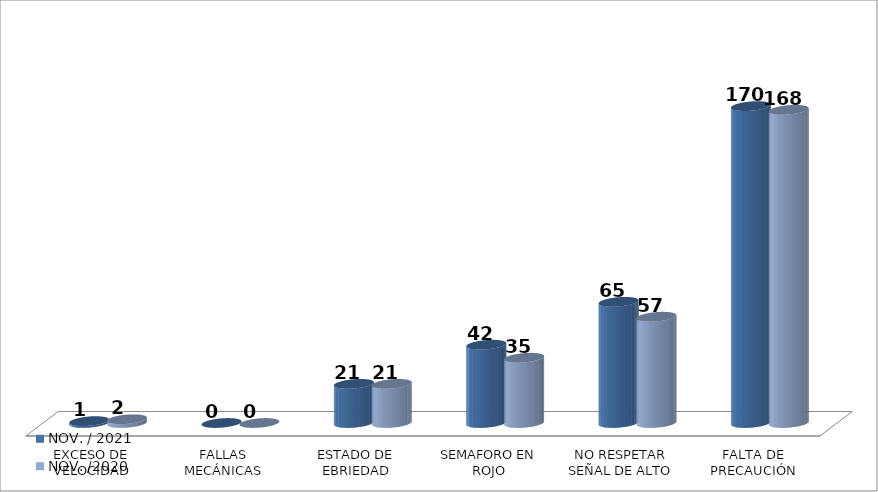
| Category | NOV. / 2021 | NOV. /2020 |
|---|---|---|
| EXCESO DE VELOCIDAD | 1 | 2 |
| FALLAS MECÁNICAS | 0 | 0 |
| ESTADO DE EBRIEDAD | 21 | 21 |
| SEMAFORO EN ROJO | 42 | 35 |
| NO RESPETAR SEÑAL DE ALTO | 65 | 57 |
| FALTA DE PRECAUCIÓN | 170 | 168 |